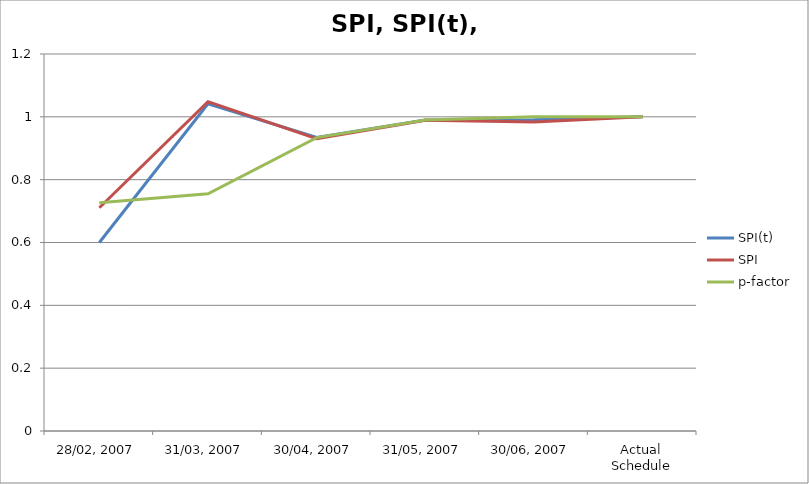
| Category | SPI(t) | SPI | p-factor |
|---|---|---|---|
| 28/02, 2007 | 0.6 | 0.711 | 0.726 |
| 31/03, 2007 | 1.042 | 1.048 | 0.755 |
| 30/04, 2007 | 0.935 | 0.931 | 0.934 |
| 31/05, 2007 | 0.99 | 0.989 | 0.99 |
| 30/06, 2007 | 0.991 | 0.983 | 1 |
| Actual Schedule | 1 | 1 | 1 |